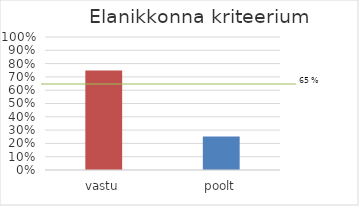
| Category | Series 0 |
|---|---|
| 0 | 0.749 |
| 1 | 0.251 |